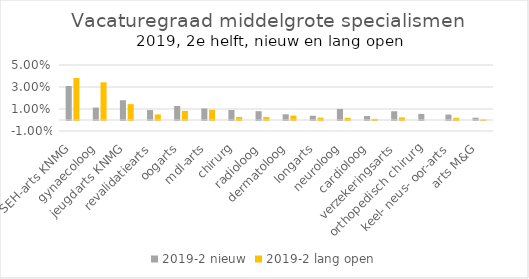
| Category | 2019-2 |
|---|---|
| SEH-arts KNMG | 0.038 |
| gynaecoloog | 0.034 |
| jeugdarts KNMG | 0.014 |
| revalidatiearts | 0.005 |
| oogarts | 0.008 |
| mdl-arts | 0.009 |
| chirurg | 0.003 |
| radioloog | 0.003 |
| dermatoloog | 0.004 |
| longarts | 0.002 |
| neuroloog | 0.002 |
| cardioloog | 0.001 |
| verzekeringsarts | 0.002 |
| orthopedisch chirurg | 0 |
| keel- neus- oor-arts | 0.002 |
| arts M&G | 0.001 |